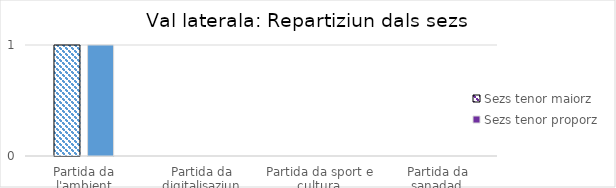
| Category | Sezs tenor maiorz | Sezs tenor proporz |
|---|---|---|
| Partida da l'ambient | 1 | 1 |
| Partida da digitalisaziun | 0 | 0 |
| Partida da sport e cultura  | 0 | 0 |
| Partida da sanadad  | 0 | 0 |